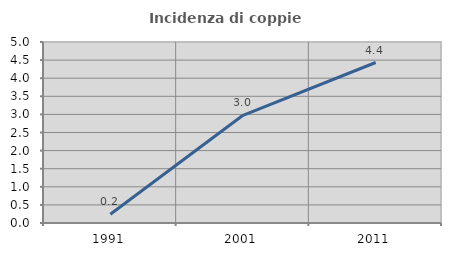
| Category | Incidenza di coppie miste |
|---|---|
| 1991.0 | 0.242 |
| 2001.0 | 2.976 |
| 2011.0 | 4.434 |